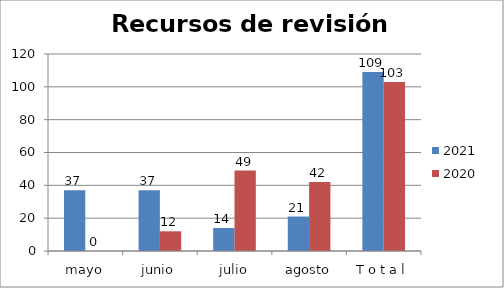
| Category | 2021 | 2020 |
|---|---|---|
| mayo | 37 | 0 |
| junio | 37 | 12 |
| julio | 14 | 49 |
| agosto | 21 | 42 |
| T o t a l | 109 | 103 |